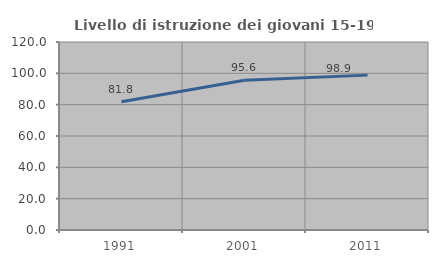
| Category | Livello di istruzione dei giovani 15-19 anni |
|---|---|
| 1991.0 | 81.847 |
| 2001.0 | 95.572 |
| 2011.0 | 98.857 |